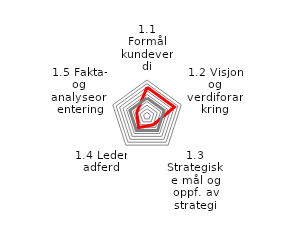
| Category | Series 0 | Series 1 |
|---|---|---|
| 1.1 Formål kundeverdi | 8 | 5 |
| 1.2 Visjon og verdiforankring | 8 | 5 |
| 1.3 Strategiske mål og oppf. av strategi | 3 | 5 |
| 1.4 Leder adferd | 4 | 5 |
| 1.5 Fakta- og analyseorientering | 3 | 5 |